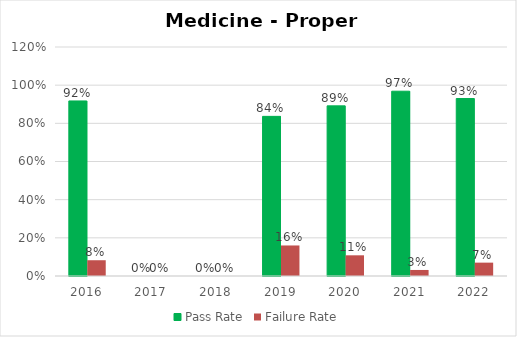
| Category | Pass Rate | Failure Rate |
|---|---|---|
| 2016.0 | 0.917 | 0.083 |
| 2017.0 | 0 | 0 |
| 2018.0 | 0 | 0 |
| 2019.0 | 0.836 | 0.16 |
| 2020.0 | 0.892 | 0.108 |
| 2021.0 | 0.968 | 0.032 |
| 2022.0 | 0.93 | 0.07 |